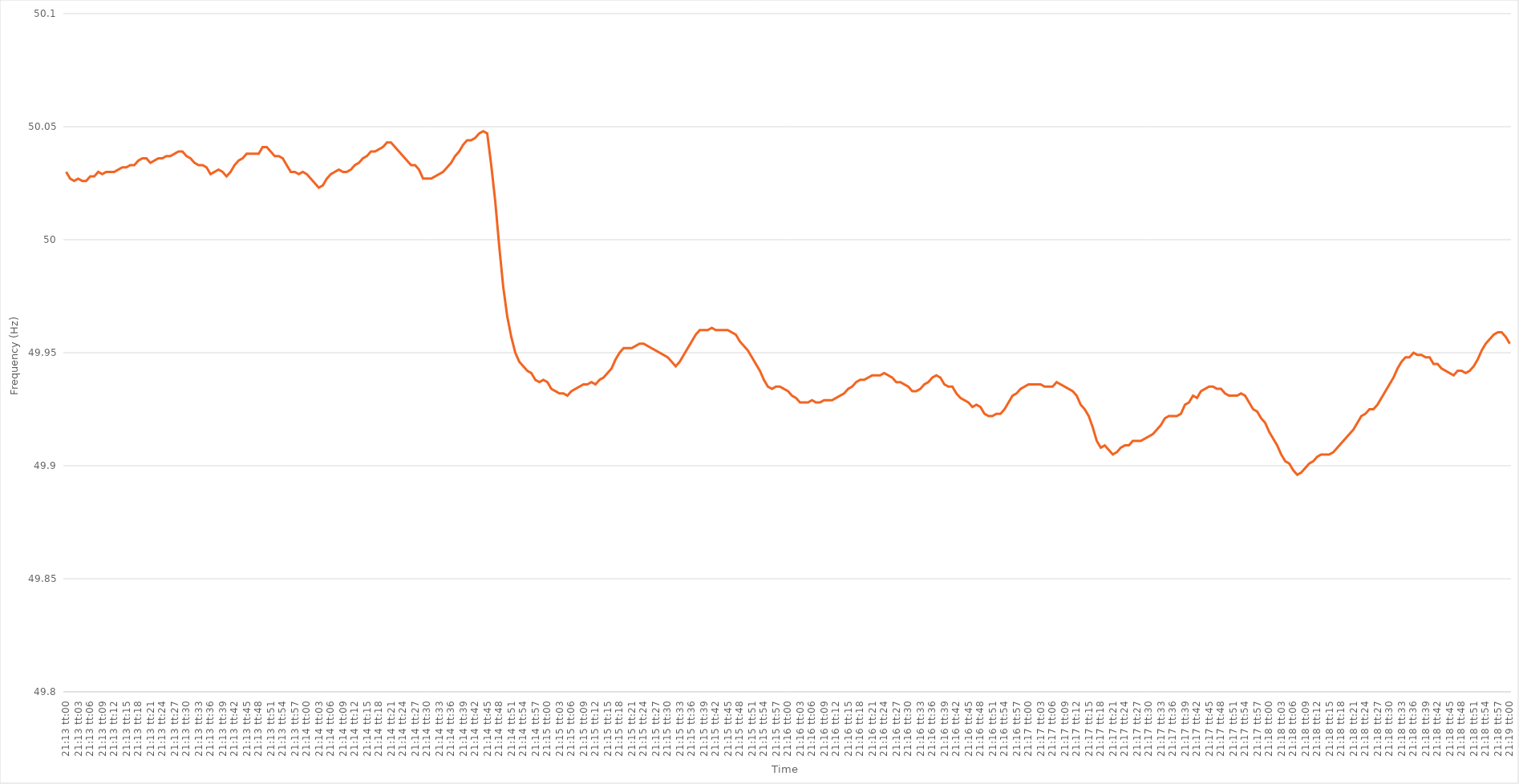
| Category | Series 0 |
|---|---|
| 0.8840277777777777 | 50.03 |
| 0.8840393518518518 | 50.027 |
| 0.8840509259259259 | 50.026 |
| 0.8840625000000001 | 50.027 |
| 0.884074074074074 | 50.026 |
| 0.8840856481481482 | 50.026 |
| 0.8840972222222222 | 50.028 |
| 0.8841087962962964 | 50.028 |
| 0.8841203703703703 | 50.03 |
| 0.8841319444444444 | 50.029 |
| 0.8841435185185186 | 50.03 |
| 0.8841550925925926 | 50.03 |
| 0.8841666666666667 | 50.03 |
| 0.8841782407407407 | 50.031 |
| 0.8841898148148148 | 50.032 |
| 0.884201388888889 | 50.032 |
| 0.8842129629629629 | 50.033 |
| 0.8842245370370371 | 50.033 |
| 0.8842361111111111 | 50.035 |
| 0.8842476851851852 | 50.036 |
| 0.8842592592592592 | 50.036 |
| 0.8842708333333333 | 50.034 |
| 0.8842824074074075 | 50.035 |
| 0.8842939814814814 | 50.036 |
| 0.8843055555555556 | 50.036 |
| 0.8843171296296296 | 50.037 |
| 0.8843287037037038 | 50.037 |
| 0.8843402777777777 | 50.038 |
| 0.8843518518518518 | 50.039 |
| 0.884363425925926 | 50.039 |
| 0.884375 | 50.037 |
| 0.8843865740740741 | 50.036 |
| 0.8843981481481481 | 50.034 |
| 0.8844097222222222 | 50.033 |
| 0.8844212962962964 | 50.033 |
| 0.8844328703703703 | 50.032 |
| 0.8844444444444445 | 50.029 |
| 0.8844560185185185 | 50.03 |
| 0.8844675925925927 | 50.031 |
| 0.8844791666666666 | 50.03 |
| 0.8844907407407407 | 50.028 |
| 0.8845023148148149 | 50.03 |
| 0.8845138888888888 | 50.033 |
| 0.884525462962963 | 50.035 |
| 0.884537037037037 | 50.036 |
| 0.8845486111111112 | 50.038 |
| 0.8845601851851851 | 50.038 |
| 0.8845717592592592 | 50.038 |
| 0.8845833333333334 | 50.038 |
| 0.8845949074074074 | 50.041 |
| 0.8846064814814815 | 50.041 |
| 0.8846180555555555 | 50.039 |
| 0.8846296296296297 | 50.037 |
| 0.8846412037037038 | 50.037 |
| 0.8846527777777777 | 50.036 |
| 0.8846643518518519 | 50.033 |
| 0.8846759259259259 | 50.03 |
| 0.8846875000000001 | 50.03 |
| 0.884699074074074 | 50.029 |
| 0.8847106481481481 | 50.03 |
| 0.8847222222222223 | 50.029 |
| 0.8847337962962962 | 50.027 |
| 0.8847453703703704 | 50.025 |
| 0.8847569444444444 | 50.023 |
| 0.8847685185185186 | 50.024 |
| 0.8847800925925925 | 50.027 |
| 0.8847916666666666 | 50.029 |
| 0.8848032407407408 | 50.03 |
| 0.8848148148148148 | 50.031 |
| 0.8848263888888889 | 50.03 |
| 0.8848379629629629 | 50.03 |
| 0.8848495370370371 | 50.031 |
| 0.8848611111111112 | 50.033 |
| 0.8848726851851851 | 50.034 |
| 0.8848842592592593 | 50.036 |
| 0.8848958333333333 | 50.037 |
| 0.8849074074074075 | 50.039 |
| 0.8849189814814814 | 50.039 |
| 0.8849305555555556 | 50.04 |
| 0.8849421296296297 | 50.041 |
| 0.8849537037037036 | 50.043 |
| 0.8849652777777778 | 50.043 |
| 0.8849768518518518 | 50.041 |
| 0.884988425925926 | 50.039 |
| 0.8849999999999999 | 50.037 |
| 0.885011574074074 | 50.035 |
| 0.8850231481481482 | 50.033 |
| 0.8850347222222222 | 50.033 |
| 0.8850462962962963 | 50.031 |
| 0.8850578703703703 | 50.027 |
| 0.8850694444444445 | 50.027 |
| 0.8850810185185186 | 50.027 |
| 0.8850925925925925 | 50.028 |
| 0.8851041666666667 | 50.029 |
| 0.8851157407407407 | 50.03 |
| 0.8851273148148149 | 50.032 |
| 0.8851388888888888 | 50.034 |
| 0.885150462962963 | 50.037 |
| 0.8851620370370371 | 50.039 |
| 0.8851736111111111 | 50.042 |
| 0.8851851851851852 | 50.044 |
| 0.8851967592592592 | 50.044 |
| 0.8852083333333334 | 50.045 |
| 0.8852199074074073 | 50.047 |
| 0.8852314814814815 | 50.048 |
| 0.8852430555555556 | 50.047 |
| 0.8852546296296296 | 50.033 |
| 0.8852662037037037 | 50.017 |
| 0.8852777777777777 | 49.997 |
| 0.8852893518518519 | 49.979 |
| 0.885300925925926 | 49.966 |
| 0.8853125 | 49.957 |
| 0.8853240740740741 | 49.95 |
| 0.8853356481481481 | 49.946 |
| 0.8853472222222223 | 49.944 |
| 0.8853587962962962 | 49.942 |
| 0.8853703703703704 | 49.941 |
| 0.8853819444444445 | 49.938 |
| 0.8853935185185186 | 49.937 |
| 0.8854050925925926 | 49.938 |
| 0.8854166666666666 | 49.937 |
| 0.8854282407407408 | 49.934 |
| 0.8854398148148147 | 49.933 |
| 0.8854513888888889 | 49.932 |
| 0.885462962962963 | 49.932 |
| 0.885474537037037 | 49.931 |
| 0.8854861111111111 | 49.933 |
| 0.8854976851851851 | 49.934 |
| 0.8855092592592593 | 49.935 |
| 0.8855208333333334 | 49.936 |
| 0.8855324074074074 | 49.936 |
| 0.8855439814814815 | 49.937 |
| 0.8855555555555555 | 49.936 |
| 0.8855671296296297 | 49.938 |
| 0.8855787037037036 | 49.939 |
| 0.8855902777777778 | 49.941 |
| 0.8856018518518519 | 49.943 |
| 0.885613425925926 | 49.947 |
| 0.885625 | 49.95 |
| 0.885636574074074 | 49.952 |
| 0.8856481481481482 | 49.952 |
| 0.8856597222222221 | 49.952 |
| 0.8856712962962963 | 49.953 |
| 0.8856828703703704 | 49.954 |
| 0.8856944444444445 | 49.954 |
| 0.8857060185185185 | 49.953 |
| 0.8857175925925925 | 49.952 |
| 0.8857291666666667 | 49.951 |
| 0.8857407407407408 | 49.95 |
| 0.8857523148148148 | 49.949 |
| 0.8857638888888889 | 49.948 |
| 0.885775462962963 | 49.946 |
| 0.8857870370370371 | 49.944 |
| 0.885798611111111 | 49.946 |
| 0.8858101851851852 | 49.949 |
| 0.8858217592592593 | 49.952 |
| 0.8858333333333334 | 49.955 |
| 0.8858449074074074 | 49.958 |
| 0.8858564814814814 | 49.96 |
| 0.8858680555555556 | 49.96 |
| 0.8858796296296297 | 49.96 |
| 0.8858912037037037 | 49.961 |
| 0.8859027777777778 | 49.96 |
| 0.8859143518518519 | 49.96 |
| 0.8859259259259259 | 49.96 |
| 0.8859374999999999 | 49.96 |
| 0.8859490740740741 | 49.959 |
| 0.8859606481481482 | 49.958 |
| 0.8859722222222222 | 49.955 |
| 0.8859837962962963 | 49.953 |
| 0.8859953703703703 | 49.951 |
| 0.8860069444444445 | 49.948 |
| 0.8860185185185184 | 49.945 |
| 0.8860300925925926 | 49.942 |
| 0.8860416666666667 | 49.938 |
| 0.8860532407407408 | 49.935 |
| 0.8860648148148148 | 49.934 |
| 0.8860763888888888 | 49.935 |
| 0.886087962962963 | 49.935 |
| 0.8860995370370371 | 49.934 |
| 0.8861111111111111 | 49.933 |
| 0.8861226851851852 | 49.931 |
| 0.8861342592592593 | 49.93 |
| 0.8861458333333333 | 49.928 |
| 0.8861574074074073 | 49.928 |
| 0.8861689814814815 | 49.928 |
| 0.8861805555555556 | 49.929 |
| 0.8861921296296296 | 49.928 |
| 0.8862037037037037 | 49.928 |
| 0.8862152777777778 | 49.929 |
| 0.8862268518518519 | 49.929 |
| 0.8862384259259258 | 49.929 |
| 0.88625 | 49.93 |
| 0.8862615740740741 | 49.931 |
| 0.8862731481481482 | 49.932 |
| 0.8862847222222222 | 49.934 |
| 0.8862962962962962 | 49.935 |
| 0.8863078703703704 | 49.937 |
| 0.8863194444444445 | 49.938 |
| 0.8863310185185185 | 49.938 |
| 0.8863425925925926 | 49.939 |
| 0.8863541666666667 | 49.94 |
| 0.8863657407407407 | 49.94 |
| 0.8863773148148147 | 49.94 |
| 0.8863888888888889 | 49.941 |
| 0.886400462962963 | 49.94 |
| 0.886412037037037 | 49.939 |
| 0.8864236111111111 | 49.937 |
| 0.8864351851851852 | 49.937 |
| 0.8864467592592593 | 49.936 |
| 0.8864583333333332 | 49.935 |
| 0.8864699074074074 | 49.933 |
| 0.8864814814814815 | 49.933 |
| 0.8864930555555556 | 49.934 |
| 0.8865046296296296 | 49.936 |
| 0.8865162037037037 | 49.937 |
| 0.8865277777777778 | 49.939 |
| 0.886539351851852 | 49.94 |
| 0.8865509259259259 | 49.939 |
| 0.8865625 | 49.936 |
| 0.8865740740740741 | 49.935 |
| 0.8865856481481482 | 49.935 |
| 0.8865972222222221 | 49.932 |
| 0.8866087962962963 | 49.93 |
| 0.8866203703703704 | 49.929 |
| 0.8866319444444444 | 49.928 |
| 0.8866435185185185 | 49.926 |
| 0.8866550925925926 | 49.927 |
| 0.8866666666666667 | 49.926 |
| 0.8866782407407406 | 49.923 |
| 0.8866898148148148 | 49.922 |
| 0.8867013888888889 | 49.922 |
| 0.886712962962963 | 49.923 |
| 0.886724537037037 | 49.923 |
| 0.8867361111111111 | 49.925 |
| 0.8867476851851852 | 49.928 |
| 0.8867592592592594 | 49.931 |
| 0.8867708333333333 | 49.932 |
| 0.8867824074074074 | 49.934 |
| 0.8867939814814815 | 49.935 |
| 0.8868055555555556 | 49.936 |
| 0.8868171296296296 | 49.936 |
| 0.8868287037037037 | 49.936 |
| 0.8868402777777779 | 49.936 |
| 0.8868518518518518 | 49.935 |
| 0.8868634259259259 | 49.935 |
| 0.886875 | 49.935 |
| 0.8868865740740741 | 49.937 |
| 0.886898148148148 | 49.936 |
| 0.8869097222222222 | 49.935 |
| 0.8869212962962963 | 49.934 |
| 0.8869328703703704 | 49.933 |
| 0.8869444444444444 | 49.931 |
| 0.8869560185185185 | 49.927 |
| 0.8869675925925926 | 49.925 |
| 0.8869791666666668 | 49.922 |
| 0.8869907407407407 | 49.917 |
| 0.8870023148148148 | 49.911 |
| 0.8870138888888889 | 49.908 |
| 0.887025462962963 | 49.909 |
| 0.887037037037037 | 49.907 |
| 0.8870486111111111 | 49.905 |
| 0.8870601851851853 | 49.906 |
| 0.8870717592592593 | 49.908 |
| 0.8870833333333333 | 49.909 |
| 0.8870949074074074 | 49.909 |
| 0.8871064814814815 | 49.911 |
| 0.8871180555555555 | 49.911 |
| 0.8871296296296296 | 49.911 |
| 0.8871412037037038 | 49.912 |
| 0.8871527777777778 | 49.913 |
| 0.8871643518518518 | 49.914 |
| 0.8871759259259259 | 49.916 |
| 0.8871875 | 49.918 |
| 0.8871990740740742 | 49.921 |
| 0.8872106481481481 | 49.922 |
| 0.8872222222222222 | 49.922 |
| 0.8872337962962963 | 49.922 |
| 0.8872453703703704 | 49.923 |
| 0.8872569444444444 | 49.927 |
| 0.8872685185185185 | 49.928 |
| 0.8872800925925927 | 49.931 |
| 0.8872916666666667 | 49.93 |
| 0.8873032407407407 | 49.933 |
| 0.8873148148148148 | 49.934 |
| 0.8873263888888889 | 49.935 |
| 0.8873379629629629 | 49.935 |
| 0.887349537037037 | 49.934 |
| 0.8873611111111112 | 49.934 |
| 0.8873726851851852 | 49.932 |
| 0.8873842592592592 | 49.931 |
| 0.8873958333333333 | 49.931 |
| 0.8874074074074074 | 49.931 |
| 0.8874189814814816 | 49.932 |
| 0.8874305555555555 | 49.931 |
| 0.8874421296296297 | 49.928 |
| 0.8874537037037037 | 49.925 |
| 0.8874652777777778 | 49.924 |
| 0.8874768518518518 | 49.921 |
| 0.8874884259259259 | 49.919 |
| 0.8875000000000001 | 49.915 |
| 0.8875115740740741 | 49.912 |
| 0.8875231481481481 | 49.909 |
| 0.8875347222222222 | 49.905 |
| 0.8875462962962963 | 49.902 |
| 0.8875578703703703 | 49.901 |
| 0.8875694444444444 | 49.898 |
| 0.8875810185185186 | 49.896 |
| 0.8875925925925926 | 49.897 |
| 0.8876041666666666 | 49.899 |
| 0.8876157407407407 | 49.901 |
| 0.8876273148148148 | 49.902 |
| 0.887638888888889 | 49.904 |
| 0.8876504629629629 | 49.905 |
| 0.887662037037037 | 49.905 |
| 0.8876736111111111 | 49.905 |
| 0.8876851851851852 | 49.906 |
| 0.8876967592592592 | 49.908 |
| 0.8877083333333333 | 49.91 |
| 0.8877199074074075 | 49.912 |
| 0.8877314814814815 | 49.914 |
| 0.8877430555555555 | 49.916 |
| 0.8877546296296296 | 49.919 |
| 0.8877662037037037 | 49.922 |
| 0.8877777777777777 | 49.923 |
| 0.8877893518518518 | 49.925 |
| 0.887800925925926 | 49.925 |
| 0.8878125 | 49.927 |
| 0.887824074074074 | 49.93 |
| 0.8878356481481481 | 49.933 |
| 0.8878472222222222 | 49.936 |
| 0.8878587962962964 | 49.939 |
| 0.8878703703703703 | 49.943 |
| 0.8878819444444445 | 49.946 |
| 0.8878935185185185 | 49.948 |
| 0.8879050925925926 | 49.948 |
| 0.8879166666666666 | 49.95 |
| 0.8879282407407407 | 49.949 |
| 0.8879398148148149 | 49.949 |
| 0.8879513888888889 | 49.948 |
| 0.887962962962963 | 49.948 |
| 0.887974537037037 | 49.945 |
| 0.8879861111111111 | 49.945 |
| 0.8879976851851853 | 49.943 |
| 0.8880092592592592 | 49.942 |
| 0.8880208333333334 | 49.941 |
| 0.8880324074074074 | 49.94 |
| 0.8880439814814814 | 49.942 |
| 0.8880555555555555 | 49.942 |
| 0.8880671296296296 | 49.941 |
| 0.8880787037037038 | 49.942 |
| 0.8880902777777777 | 49.944 |
| 0.8881018518518519 | 49.947 |
| 0.8881134259259259 | 49.951 |
| 0.888125 | 49.954 |
| 0.888136574074074 | 49.956 |
| 0.8881481481481481 | 49.958 |
| 0.8881597222222223 | 49.959 |
| 0.8881712962962963 | 49.959 |
| 0.8881828703703704 | 49.957 |
| 0.8881944444444444 | 49.954 |